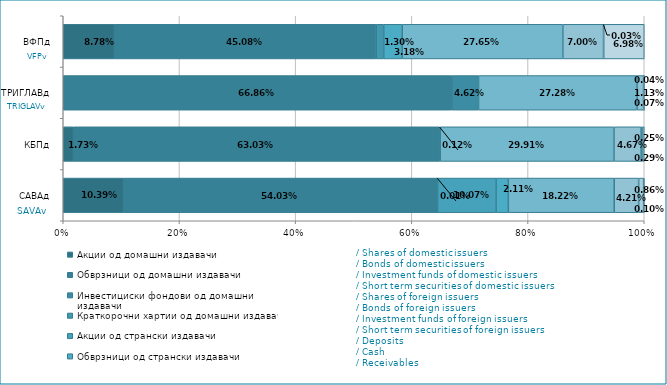
| Category | Акции од домашни издавачи  | Обврзници од домашни издавачи  | Инвестициски фондови од домашни издавачи   | Краткорочни хартии од домашни издавачи   | Акции од странски издавачи   | Обврзници од странски издавачи  | Инвестициски фондови од странски издавaчи  | Краткорочни хартии од странски издавачи  | Депозити | Парични средства | Побарувања |
|---|---|---|---|---|---|---|---|---|---|---|---|
| САВАд | 0.104 | 0.54 | 0 | 0 | 0.101 | 0.021 | 0.182 | 0 | 0.042 | 0.009 | 0.001 |
| КБПд | 0.017 | 0.63 | 0.001 | 0 | 0 | 0 | 0.299 | 0 | 0.047 | 0.002 | 0.003 |
| ТРИГЛАВд | 0 | 0.669 | 0.046 | 0 | 0 | 0 | 0.273 | 0 | 0.011 | 0.001 | 0 |
| ВФПд | 0.088 | 0.451 | 0 | 0.013 | 0 | 0.032 | 0.277 | 0 | 0.07 | 0 | 0.07 |